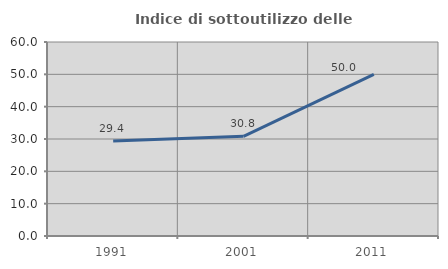
| Category | Indice di sottoutilizzo delle abitazioni  |
|---|---|
| 1991.0 | 29.412 |
| 2001.0 | 30.841 |
| 2011.0 | 50 |